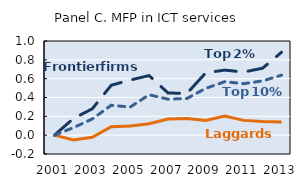
| Category | Series 0 | Series 1 | Series 2 |
|---|---|---|---|
| 2001.0 | 0 | 0 | 0 |
| 2002.0 | 0.177 | -0.052 | 0.08 |
| 2003.0 | 0.28 | -0.022 | 0.172 |
| 2004.0 | 0.53 | 0.089 | 0.317 |
| 2005.0 | 0.585 | 0.099 | 0.298 |
| 2006.0 | 0.633 | 0.121 | 0.429 |
| 2007.0 | 0.448 | 0.172 | 0.382 |
| 2008.0 | 0.443 | 0.178 | 0.39 |
| 2009.0 | 0.663 | 0.156 | 0.498 |
| 2010.0 | 0.691 | 0.204 | 0.568 |
| 2011.0 | 0.671 | 0.157 | 0.547 |
| 2012.0 | 0.711 | 0.145 | 0.576 |
| 2013.0 | 0.88 | 0.141 | 0.637 |